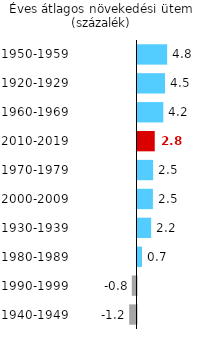
| Category | Magyar GDP éves átlagos változása |
|---|---|
| 1940-1949 | -1.194 |
| 1990-1999 | -0.768 |
| 1980-1989 | 0.728 |
| 1930-1939 | 2.221 |
| 2000-2009 | 2.508 |
| 1970-1979 | 2.538 |
| 2010-2019 | 2.803 |
| 1960-1969 | 4.198 |
| 1920-1929 | 4.471 |
| 1950-1959 | 4.825 |